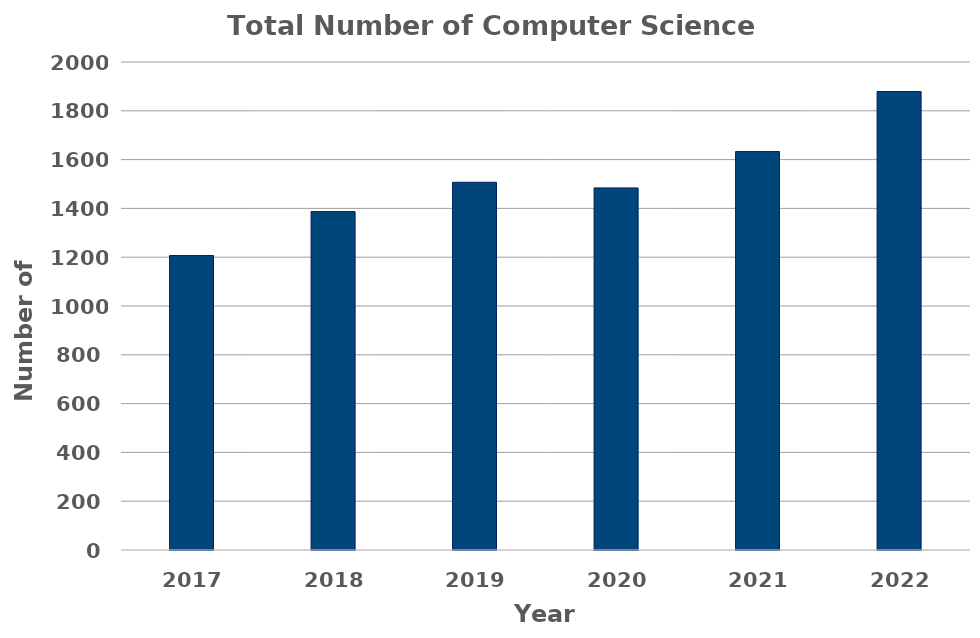
| Category | Total Number of Computer Science Students+CSEData!$D$5:$D$10 |
|---|---|
| 2017.0 | 1207 |
| 2018.0 | 1387 |
| 2019.0 | 1507 |
| 2020.0 | 1484 |
| 2021.0 | 1633 |
| 2022.0 | 1879 |